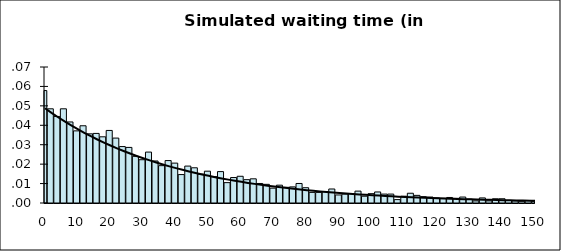
| Category | Series 1 |
|---|---|
| 0.0 | 0.058 |
| 2.0 | 0.048 |
| 4.0 | 0.045 |
| 6.0 | 0.048 |
| 8.0 | 0.042 |
| 10.0 | 0.037 |
| 12.0 | 0.04 |
| 14.0 | 0.036 |
| 16.0 | 0.036 |
| 18.0 | 0.034 |
| 20.0 | 0.037 |
| 22.0 | 0.033 |
| 24.0 | 0.029 |
| 26.0 | 0.029 |
| 28.0 | 0.024 |
| 30.0 | 0.022 |
| 32.0 | 0.026 |
| 34.0 | 0.022 |
| 36.0 | 0.019 |
| 38.0 | 0.022 |
| 40.0 | 0.021 |
| 42.0 | 0.015 |
| 44.0 | 0.019 |
| 46.0 | 0.018 |
| 48.0 | 0.015 |
| 50.0 | 0.016 |
| 52.0 | 0.014 |
| 54.0 | 0.016 |
| 56.0 | 0.01 |
| 58.0 | 0.013 |
| 60.0 | 0.014 |
| 62.0 | 0.012 |
| 64.0 | 0.012 |
| 66.0 | 0.01 |
| 68.0 | 0.01 |
| 70.0 | 0.008 |
| 72.0 | 0.009 |
| 74.0 | 0.008 |
| 76.0 | 0.008 |
| 78.0 | 0.01 |
| 80.0 | 0.008 |
| 82.0 | 0.005 |
| 84.0 | 0.005 |
| 86.0 | 0.006 |
| 88.0 | 0.007 |
| 90.0 | 0.004 |
| 92.0 | 0.005 |
| 94.0 | 0.005 |
| 96.0 | 0.006 |
| 98.0 | 0.003 |
| 100.0 | 0.005 |
| 102.0 | 0.006 |
| 104.0 | 0.005 |
| 106.0 | 0.005 |
| 108.0 | 0.002 |
| 110.0 | 0.003 |
| 112.0 | 0.005 |
| 114.0 | 0.004 |
| 116.0 | 0.003 |
| 118.0 | 0.003 |
| 120.0 | 0.003 |
| 122.0 | 0.002 |
| 124.0 | 0.003 |
| 126.0 | 0.002 |
| 128.0 | 0.003 |
| 130.0 | 0.002 |
| 132.0 | 0.001 |
| 134.0 | 0.003 |
| 136.0 | 0.001 |
| 138.0 | 0.002 |
| 140.0 | 0.002 |
| 142.0 | 0.001 |
| 144.0 | 0.001 |
| 146.0 | 0.001 |
| 148.0 | 0.001 |
| 150.0 | 0.001 |